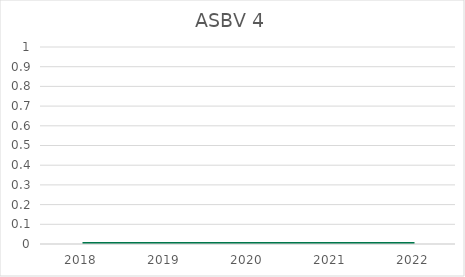
| Category | ASBV 4 |
|---|---|
| 2018.0 | 0 |
| 2019.0 | 0 |
| 2020.0 | 0 |
| 2021.0 | 0 |
| 2022.0 | 0 |